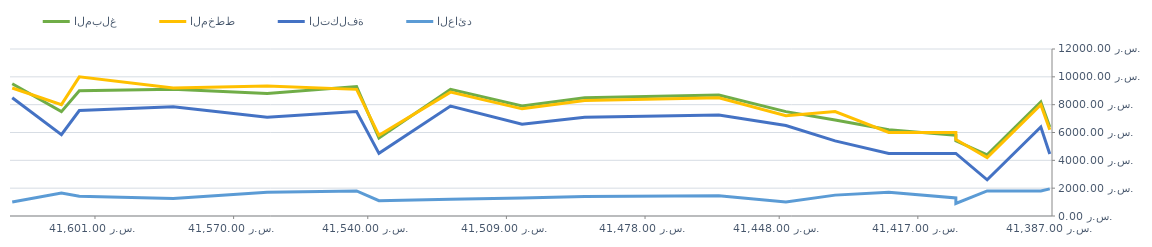
| Category | المبلغ | المخطط | التكلفة | العائد |
|---|---|---|---|---|
| 41387.0 | 6400 | 6200 | 4450 | 1950 |
| 41389.0 | 8200 | 8000 | 6400 | 1800 |
| 41401.0 | 4400 | 4200 | 2600 | 1800 |
| 41408.0 | 5400 | 5500 | 4500 | 900 |
| 41408.0 | 5800 | 6000 | 4500 | 1300 |
| 41423.0 | 6200 | 6000 | 4500 | 1700 |
| 41435.0 | 6900 | 7500 | 5400 | 1500 |
| 41446.0 | 7500 | 7200 | 6500 | 1000 |
| 41461.0 | 8700 | 8500 | 7250 | 1450 |
| 41491.0 | 8500 | 8300 | 7100 | 1400 |
| 41505.0 | 7900 | 7700 | 6600 | 1300 |
| 41521.0 | 9100 | 8900 | 7900 | 1200 |
| 41537.0 | 5600 | 5800 | 4500 | 1100 |
| 41542.0 | 9300 | 9100 | 7500 | 1800 |
| 41562.0 | 8800 | 9350 | 7100 | 1700 |
| 41583.0 | 9100 | 9200 | 7850 | 1250 |
| 41604.0 | 9000 | 10000 | 7575 | 1425 |
| 41608.0 | 7500 | 8000 | 5850 | 1650 |
| 41619.0 | 9500 | 9200 | 8500 | 1000 |